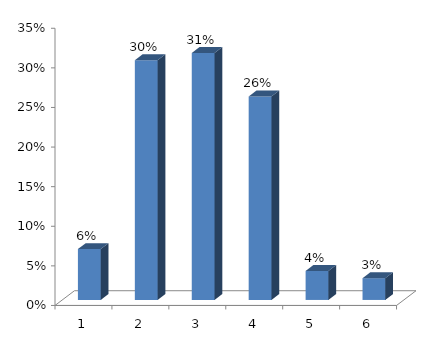
| Category | Series 0 |
|---|---|
| 0 | 0.064 |
| 1 | 0.303 |
| 2 | 0.312 |
| 3 | 0.257 |
| 4 | 0.037 |
| 5 | 0.028 |